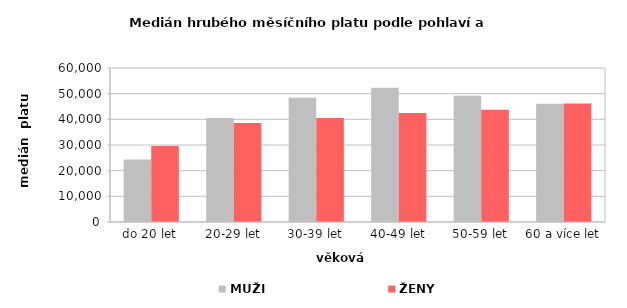
| Category | MUŽI | ŽENY |
|---|---|---|
| 0 | 24304.518 | 29593.306 |
| 1 | 40524.786 | 38602.885 |
| 2 | 48397.031 | 40521.189 |
| 3 | 52304.416 | 42510.332 |
| 4 | 49173.367 | 43760.761 |
| 5 | 46023.098 | 46204.549 |